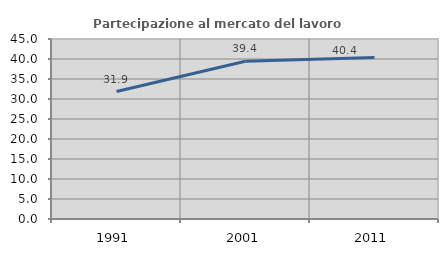
| Category | Partecipazione al mercato del lavoro  femminile |
|---|---|
| 1991.0 | 31.87 |
| 2001.0 | 39.429 |
| 2011.0 | 40.367 |